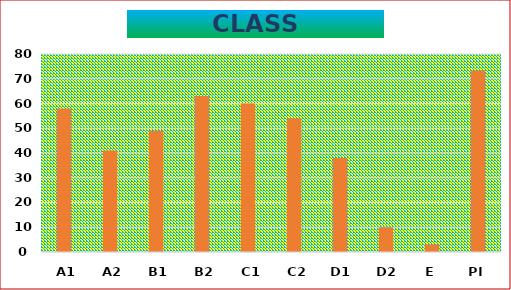
| Category | Series 0 |
|---|---|
| A1 | 58 |
| A2 | 41 |
| B1 | 49 |
| B2 | 63 |
| C1 | 60 |
| C2 | 54 |
| D1 | 38 |
| D2 | 10 |
| E | 3 |
| PI | 73.33 |